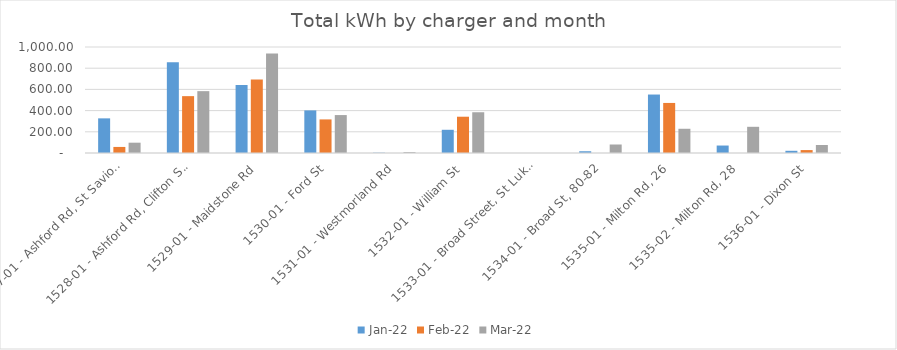
| Category | Jan-22 | Feb-22 | Mar-22 |
|---|---|---|---|
| 1527-01 - Ashford Rd, St Saviour's | 326.82 | 57.18 | 97.28 |
| 1528-01 - Ashford Rd, Clifton St Jcn | 855.09 | 536.37 | 583.57 |
| 1529-01 - Maidstone Rd | 641.19 | 694.43 | 938.73 |
| 1530-01 - Ford St | 401.96 | 316.87 | 357.84 |
| 1531-01 - Westmorland Rd | 2.7 | 0 | 8.56 |
| 1532-01 - William St | 218.99 | 342.27 | 384.48 |
| 1533-01 - Broad Street, St Luke's | 0 | 0 | 0 |
| 1534-01 - Broad St, 80-82 | 16.51 | 0 | 80.21 |
| 1535-01 - Milton Rd, 26 | 551.54 | 472.22 | 228.63 |
| 1535-02 - Milton Rd, 28 | 70.43 | 0 | 247.15 |
| 1536-01 - Dixon St | 20.83 | 27.49 | 75.4 |